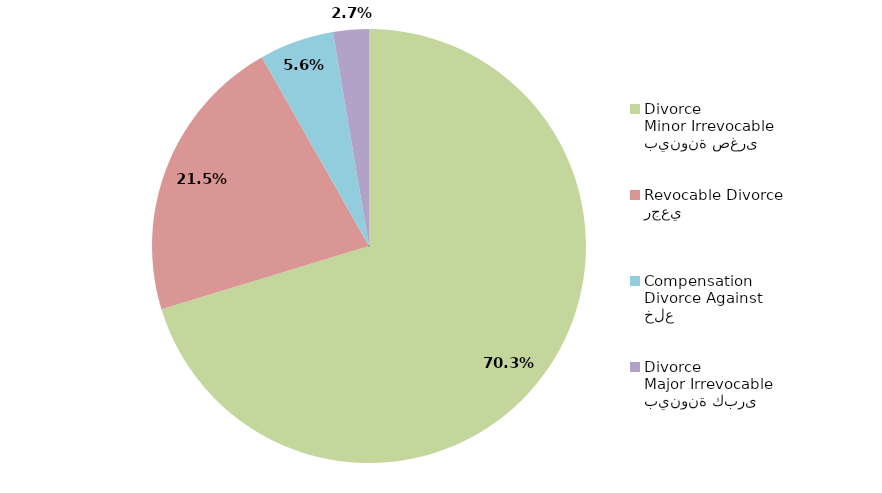
| Category | Series 1 |
|---|---|
| بينونة صغرى
Minor Irrevocable Divorce  | 70.29 |
| رجعي
Revocable Divorce  | 21.498 |
| خلع
Divorce Against Compensation | 5.556 |
| بينونة كبرى
Major Irrevocable Divorce  | 2.657 |